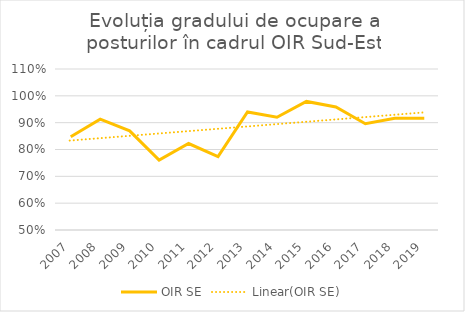
| Category | OIR SE |
|---|---|
| 2007.0 | 0.848 |
| 2008.0 | 0.913 |
| 2009.0 | 0.87 |
| 2010.0 | 0.761 |
| 2011.0 | 0.822 |
| 2012.0 | 0.774 |
| 2013.0 | 0.94 |
| 2014.0 | 0.92 |
| 2015.0 | 0.979 |
| 2016.0 | 0.958 |
| 2017.0 | 0.896 |
| 2018.0 | 0.917 |
| 2019.0 | 0.917 |